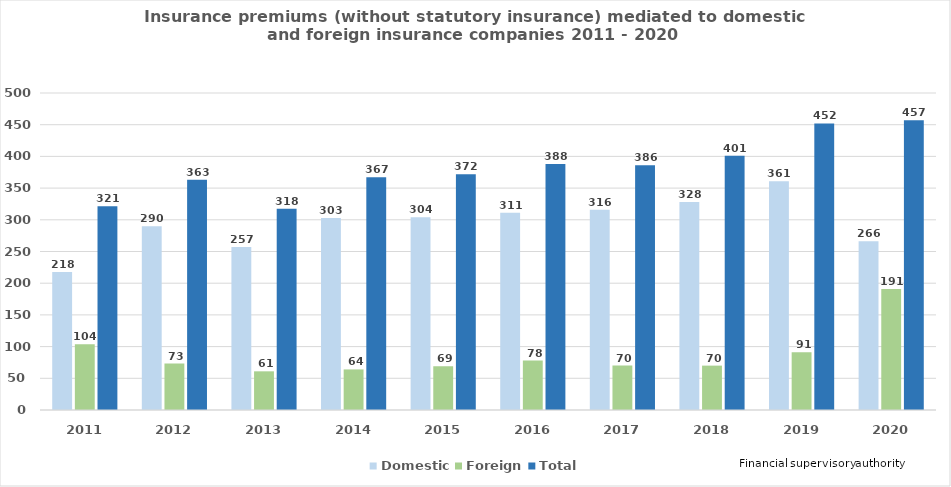
| Category | Domestic | Foreign | Total |
|---|---|---|---|
| 2011.0 | 217.55 | 103.894 | 321.444 |
| 2012.0 | 289.922 | 73.321 | 363.243 |
| 2013.0 | 257 | 61 | 317.523 |
| 2014.0 | 303 | 64 | 367 |
| 2015.0 | 304 | 69 | 372 |
| 2016.0 | 311 | 78 | 388 |
| 2017.0 | 316 | 70 | 386 |
| 2018.0 | 328 | 70 | 401 |
| 2019.0 | 361 | 91 | 452 |
| 2020.0 | 266 | 191 | 457 |